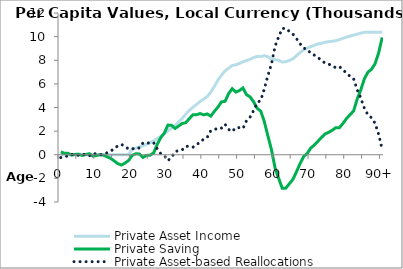
| Category | Private Asset Income | Private Saving | Private Asset-based Reallocations |
|---|---|---|---|
| 0 | 0 | 239.489 | -239.489 |
|  | 0 | 129.32 | -129.32 |
| 2 | 0 | 123.643 | -123.643 |
| 3 | 0 | -31.755 | 31.755 |
| 4 | 0 | 28.736 | -28.736 |
| 5 | 0 | 48.814 | -48.814 |
| 6 | 0 | -57.806 | 57.806 |
| 7 | 0 | 17.849 | -17.849 |
| 8 | 0 | 88.521 | -88.521 |
| 9 | 0 | -114.454 | 114.454 |
| 10 | 0 | -62.626 | 62.626 |
| 11 | 0 | 2.205 | -2.205 |
| 12 | 0 | -37.488 | 37.488 |
| 13 | 0 | -176.451 | 176.451 |
| 14 | 0 | -309.88 | 309.88 |
| 15 | 0 | -537.142 | 537.142 |
| 16 | 0 | -756.72 | 756.72 |
| 17 | 0.918 | -871.407 | 872.325 |
| 18 | 1.639 | -697.774 | 699.413 |
| 19 | 3.122 | -482.298 | 485.42 |
| 20 | 478.999 | -47.605 | 526.604 |
| 21 | 560.671 | 82.518 | 478.152 |
| 22 | 655.603 | 66.86 | 588.743 |
| 23 | 762.395 | -228.62 | 991.015 |
| 24 | 887.939 | -54.913 | 942.852 |
| 25 | 1009.585 | -40.864 | 1050.449 |
| 26 | 1178.328 | 153.064 | 1025.264 |
| 27 | 1367.037 | 880.885 | 486.153 |
| 28 | 1545.925 | 1456.413 | 89.512 |
| 29 | 1764.158 | 1839.332 | -75.174 |
| 30 | 2020.1 | 2511.333 | -491.233 |
| 31 | 2267.365 | 2496.843 | -229.478 |
| 32 | 2491.501 | 2226.683 | 264.818 |
| 33 | 2782.264 | 2431.909 | 350.355 |
| 34 | 3067.511 | 2648.616 | 418.895 |
| 35 | 3438.73 | 2716.431 | 722.299 |
| 36 | 3760.513 | 3060.23 | 700.284 |
| 37 | 4017.311 | 3382.932 | 634.379 |
| 38 | 4256.688 | 3379.74 | 876.948 |
| 39 | 4509.03 | 3489.423 | 1019.608 |
| 40 | 4710.031 | 3377.217 | 1332.815 |
| 41 | 4927.02 | 3454.629 | 1472.391 |
| 42 | 5301.793 | 3268.788 | 2033.005 |
| 43 | 5785.031 | 3675.686 | 2109.345 |
| 44 | 6314.512 | 4033.732 | 2280.779 |
| 45 | 6730.796 | 4475.058 | 2255.738 |
| 46 | 7104.317 | 4523.86 | 2580.457 |
| 47 | 7321.769 | 5178.905 | 2142.863 |
| 48 | 7561.179 | 5596.544 | 1964.635 |
| 49 | 7612.277 | 5307.932 | 2304.345 |
| 50 | 7724.821 | 5432.099 | 2292.722 |
| 51 | 7873.664 | 5654.353 | 2219.311 |
| 52 | 7970.098 | 5089.195 | 2880.903 |
| 53 | 8087.237 | 4896.405 | 3190.832 |
| 54 | 8229.365 | 4482.123 | 3747.241 |
| 55 | 8323.278 | 3921.419 | 4401.858 |
| 56 | 8303.617 | 3692.096 | 4611.521 |
| 57 | 8385.186 | 2791.363 | 5593.823 |
| 58 | 8294.031 | 1585.831 | 6708.199 |
| 59 | 8107.985 | 418.673 | 7689.312 |
| 60 | 8059.611 | -1120.045 | 9179.656 |
| 61 | 7984.91 | -1991.443 | 9976.353 |
| 62 | 7849.187 | -2832.799 | 10681.986 |
| 63 | 7883.06 | -2825.414 | 10708.474 |
| 64 | 7981.064 | -2459.431 | 10440.495 |
| 65 | 8126.362 | -2082.424 | 10208.785 |
| 66 | 8385.878 | -1441.088 | 9826.965 |
| 67 | 8652.168 | -748.335 | 9400.503 |
| 68 | 8874.21 | -154.532 | 9028.742 |
| 69 | 9036.432 | 108.338 | 8928.094 |
| 70 | 9150.546 | 567.547 | 8582.999 |
| 71 | 9259.83 | 825.216 | 8434.614 |
| 72 | 9374.319 | 1142.712 | 8231.608 |
| 73 | 9447.5 | 1464.796 | 7982.705 |
| 74 | 9517.974 | 1763.161 | 7754.813 |
| 75 | 9570.24 | 1896.959 | 7673.281 |
| 76 | 9610.31 | 2074.804 | 7535.505 |
| 77 | 9653.473 | 2288.662 | 7364.81 |
| 78 | 9748.454 | 2287.049 | 7461.405 |
| 79 | 9853.711 | 2644.627 | 7209.084 |
| 80 | 9960.347 | 3061.182 | 6899.165 |
| 81 | 10040.685 | 3396.872 | 6643.814 |
| 82 | 10129.919 | 3709.728 | 6420.19 |
| 83 | 10211.084 | 4723.349 | 5487.735 |
| 84 | 10288.053 | 5483.699 | 4804.354 |
| 85 | 10366.466 | 6428.252 | 3938.214 |
| 86 | 10366.466 | 6991.994 | 3374.472 |
| 87 | 10366.466 | 7235.952 | 3130.514 |
| 88 | 10366.466 | 7703.227 | 2663.239 |
| 89 | 10366.466 | 8624.701 | 1741.765 |
| 90+ | 10366.466 | 9936.324 | 430.142 |